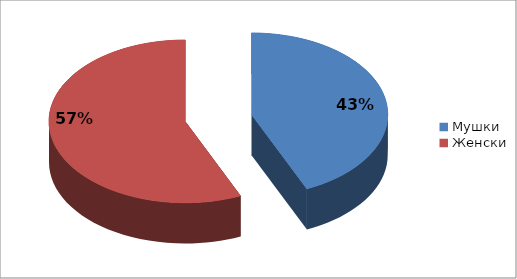
| Category | Series 0 |
|---|---|
| Мушки | 0.433 |
| Женски | 0.567 |